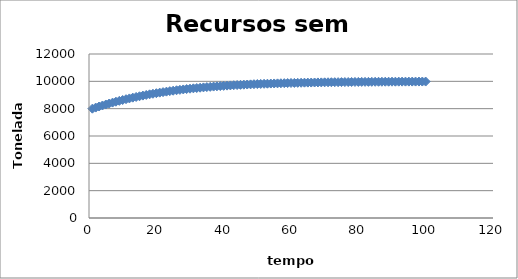
| Category | Series 0 |
|---|---|
| 1.0 | 8000 |
| 2.0 | 8080 |
| 3.0 | 8157.568 |
| 4.0 | 8232.717 |
| 5.0 | 8305.465 |
| 6.0 | 8375.834 |
| 7.0 | 8443.853 |
| 8.0 | 8509.552 |
| 9.0 | 8572.967 |
| 10.0 | 8634.137 |
| 11.0 | 8693.102 |
| 12.0 | 8749.907 |
| 13.0 | 8804.598 |
| 14.0 | 8857.223 |
| 15.0 | 8907.832 |
| 16.0 | 8956.477 |
| 17.0 | 9003.208 |
| 18.0 | 9048.08 |
| 19.0 | 9091.145 |
| 20.0 | 9132.458 |
| 21.0 | 9172.072 |
| 22.0 | 9210.041 |
| 23.0 | 9246.418 |
| 24.0 | 9281.258 |
| 25.0 | 9314.612 |
| 26.0 | 9346.533 |
| 27.0 | 9377.071 |
| 28.0 | 9406.277 |
| 29.0 | 9434.201 |
| 30.0 | 9460.89 |
| 31.0 | 9486.393 |
| 32.0 | 9510.754 |
| 33.0 | 9534.019 |
| 34.0 | 9556.233 |
| 35.0 | 9577.437 |
| 36.0 | 9597.672 |
| 37.0 | 9616.979 |
| 38.0 | 9635.397 |
| 39.0 | 9652.962 |
| 40.0 | 9669.712 |
| 41.0 | 9685.681 |
| 42.0 | 9700.903 |
| 43.0 | 9715.41 |
| 44.0 | 9729.235 |
| 45.0 | 9742.406 |
| 46.0 | 9754.954 |
| 47.0 | 9766.906 |
| 48.0 | 9778.289 |
| 49.0 | 9789.129 |
| 50.0 | 9799.45 |
| 51.0 | 9809.277 |
| 52.0 | 9818.631 |
| 53.0 | 9827.535 |
| 54.0 | 9836.01 |
| 55.0 | 9844.075 |
| 56.0 | 9851.749 |
| 57.0 | 9859.052 |
| 58.0 | 9866 |
| 59.0 | 9872.61 |
| 60.0 | 9878.899 |
| 61.0 | 9884.88 |
| 62.0 | 9890.57 |
| 63.0 | 9895.982 |
| 64.0 | 9901.128 |
| 65.0 | 9906.023 |
| 66.0 | 9910.678 |
| 67.0 | 9915.104 |
| 68.0 | 9919.313 |
| 69.0 | 9923.315 |
| 70.0 | 9927.12 |
| 71.0 | 9930.737 |
| 72.0 | 9934.176 |
| 73.0 | 9937.446 |
| 74.0 | 9940.554 |
| 75.0 | 9943.508 |
| 76.0 | 9946.317 |
| 77.0 | 9948.987 |
| 78.0 | 9951.524 |
| 79.0 | 9953.936 |
| 80.0 | 9956.229 |
| 81.0 | 9958.408 |
| 82.0 | 9960.479 |
| 83.0 | 9962.447 |
| 84.0 | 9964.318 |
| 85.0 | 9966.096 |
| 86.0 | 9967.785 |
| 87.0 | 9969.391 |
| 88.0 | 9970.916 |
| 89.0 | 9972.366 |
| 90.0 | 9973.744 |
| 91.0 | 9975.054 |
| 92.0 | 9976.298 |
| 93.0 | 9977.48 |
| 94.0 | 9978.604 |
| 95.0 | 9979.671 |
| 96.0 | 9980.685 |
| 97.0 | 9981.649 |
| 98.0 | 9982.565 |
| 99.0 | 9983.435 |
| 100.0 | 9984.262 |